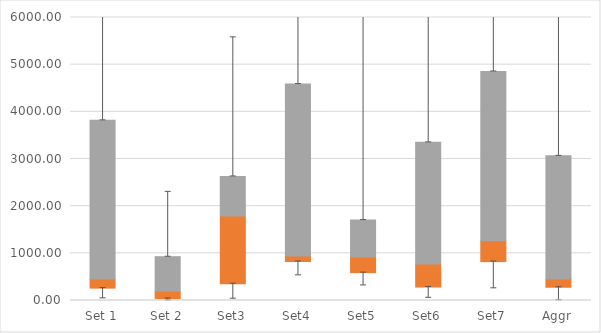
| Category | Q1 | Median-Q1 | Q3-Median |
|---|---|---|---|
| Set 1 | 262.42 | 191.104 | 3366.661 |
| Set 2 | 42.812 | 155.188 | 730.897 |
| Set3 | 356.171 | 1433.594 | 841.4 |
| Set4 | 826.728 | 118.847 | 3644.275 |
| Set5 | 590.971 | 329.349 | 784.798 |
| Set6 | 285.583 | 488.273 | 2579.263 |
| Set7 | 824.531 | 443.475 | 3589.411 |
| Aggr | 280.866 | 172.657 | 2613.06 |